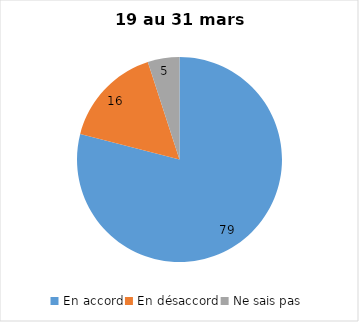
| Category | Series 0 |
|---|---|
| En accord | 79 |
| En désaccord | 16 |
| Ne sais pas | 5 |